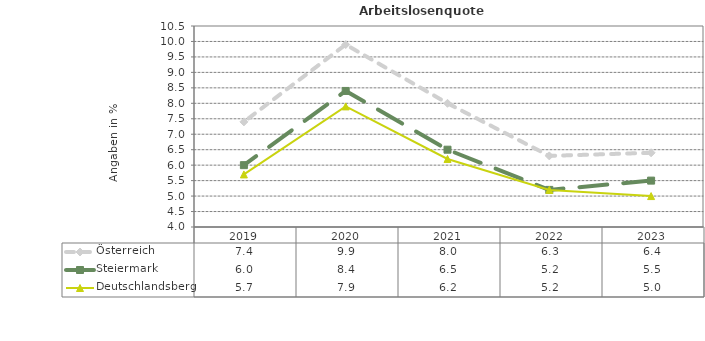
| Category | Österreich | Steiermark | Deutschlandsberg |
|---|---|---|---|
| 2023.0 | 6.4 | 5.5 | 5 |
| 2022.0 | 6.3 | 5.2 | 5.2 |
| 2021.0 | 8 | 6.5 | 6.2 |
| 2020.0 | 9.9 | 8.4 | 7.9 |
| 2019.0 | 7.4 | 6 | 5.7 |